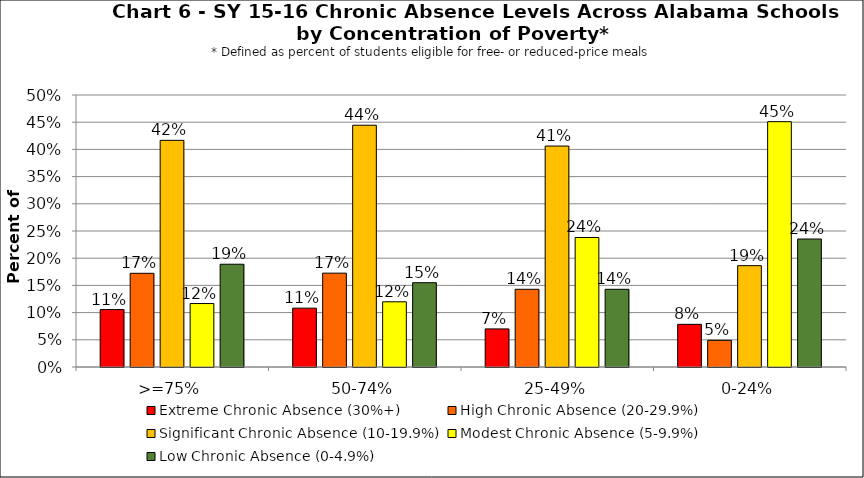
| Category | Extreme Chronic Absence (30%+) | High Chronic Absence (20-29.9%) | Significant Chronic Absence (10-19.9%) | Modest Chronic Absence (5-9.9%) | Low Chronic Absence (0-4.9%) |
|---|---|---|---|---|---|
| 0 | 0.106 | 0.172 | 0.417 | 0.117 | 0.189 |
| 1 | 0.108 | 0.173 | 0.444 | 0.12 | 0.155 |
| 2 | 0.07 | 0.143 | 0.406 | 0.238 | 0.143 |
| 3 | 0.078 | 0.049 | 0.186 | 0.451 | 0.235 |